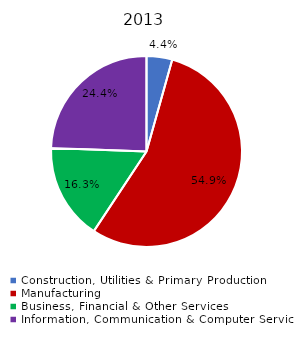
| Category | Series 0 |
|---|---|
| Construction, Utilities & Primary Production  | 0.044 |
| Manufacturing  | 0.549 |
| Business, Financial & Other Services | 0.163 |
| Information, Communication & Computer Services | 0.244 |